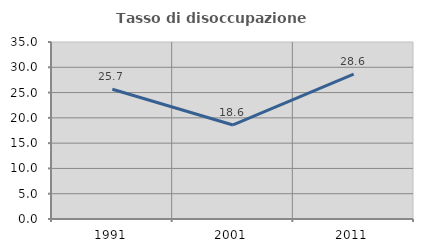
| Category | Tasso di disoccupazione giovanile  |
|---|---|
| 1991.0 | 25.668 |
| 2001.0 | 18.596 |
| 2011.0 | 28.632 |